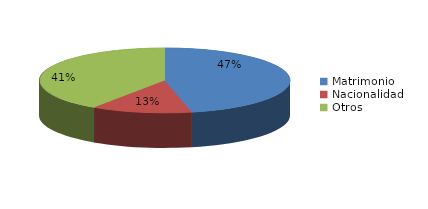
| Category | Series 0 |
|---|---|
| Matrimonio | 630 |
| Nacionalidad | 175 |
| Otros | 549 |